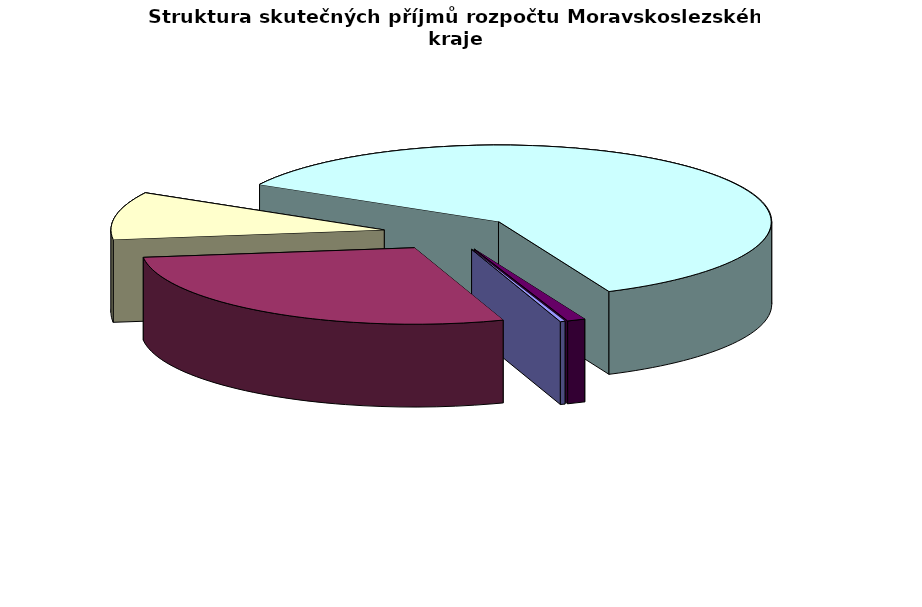
| Category | Čerpání v tis. Kč |
|---|---|
| Kapitálové příjmy | 59593.14 |
| Daňové příjmy | 5835268.282 |
| Investiční dotace | 2080221.966 |
| Neinvestiční dotace | 12453911.148 |
| Nedaňové příjmy | 221208.033 |